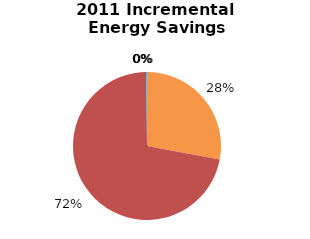
| Category | Incremental Energy Savings (kWh) |
|---|---|
| Consumer Program Total | 38938.041 |
| Business Program Total | 100177.132 |
| Industrial Program Total | 0 |
| Home Assistance Program Total | 0 |
| Pre-2011 Programs completed in 2011 Total | 229.062 |